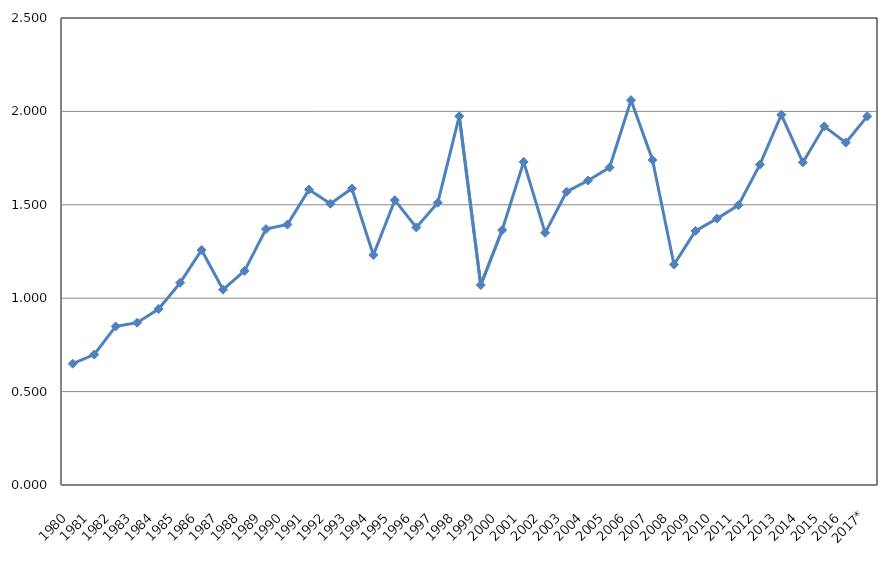
| Category | Series 0 |
|---|---|
| 1980 | 0.649 |
| 1981 | 0.698 |
| 1982 | 0.849 |
| 1983 | 0.869 |
| 1984 | 0.942 |
| 1985 | 1.082 |
| 1986 | 1.258 |
| 1987 | 1.046 |
| 1988 | 1.147 |
| 1989 | 1.37 |
| 1990 | 1.395 |
| 1991 | 1.581 |
| 1992 | 1.506 |
| 1993 | 1.587 |
| 1994 | 1.231 |
| 1995 | 1.525 |
| 1996 | 1.379 |
| 1997 | 1.511 |
| 1998 | 1.974 |
| 1999 | 1.071 |
| 2000 | 1.365 |
| 2001 | 1.73 |
| 2002 | 1.35 |
| 2003 | 1.57 |
| 2004 | 1.63 |
| 2005 | 1.7 |
| 2006 | 2.06 |
| 2007 | 1.74 |
| 2008 | 1.18 |
| 2009 | 1.36 |
| 2010 | 1.426 |
| 2011 | 1.498 |
| 2012 | 1.715 |
| 2013 | 1.982 |
| 2014 | 1.727 |
| 2015 | 1.92 |
| 2016 | 1.833 |
| 2017* | 1.973 |